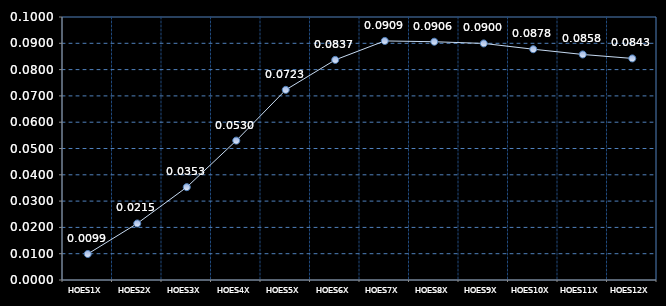
| Category | Series 0 |
|---|---|
| HOES1X | 0.01 |
| HOES2X | 0.022 |
| HOES3X | 0.035 |
| HOES4X | 0.053 |
| HOES5X | 0.072 |
| HOES6X | 0.084 |
| HOES7X | 0.091 |
| HOES8X | 0.091 |
| HOES9X | 0.09 |
| HOES10X | 0.088 |
| HOES11X | 0.086 |
| HOES12X | 0.084 |